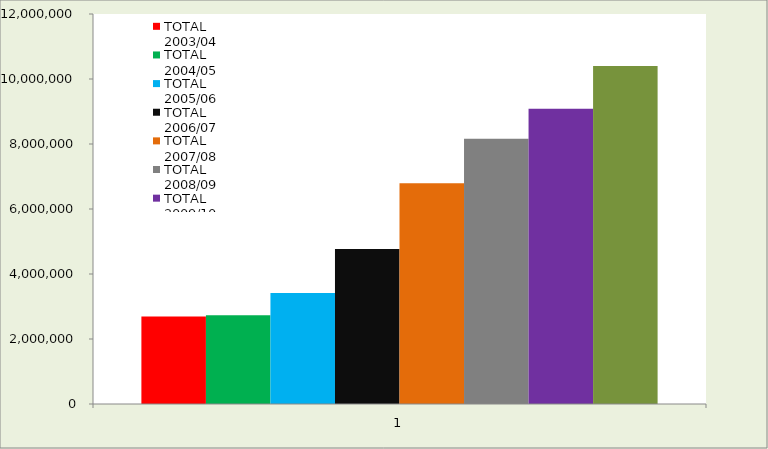
| Category | TOTAL 2003/04 | TOTAL 2004/05 | TOTAL 2005/06 | TOTAL 2006/07 | TOTAL 2007/08 | TOTAL 2008/09 | TOTAL 2009/10 | TOTAL 2010/11 |
|---|---|---|---|---|---|---|---|---|
| 0 | 2688575.406 | 2731212.232 | 3411636 | 4767206 | 6795509 | 8159602 | 9083672 | 10396401 |